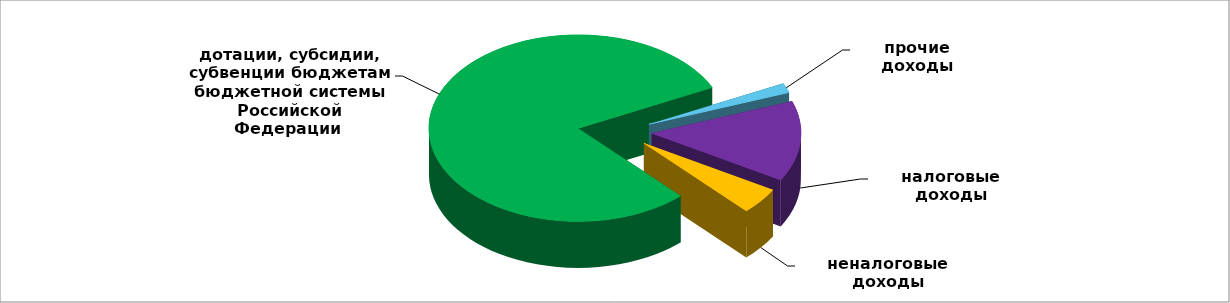
| Category | Series 0 |
|---|---|
| налоговые доходы | 13.909 |
| неналоговые доходы | 4.597 |
| дотации, субсидии, субвенции бюджетам бюджетной системы Российской Федерации | 79.839 |
| прочие доходы | 1.655 |